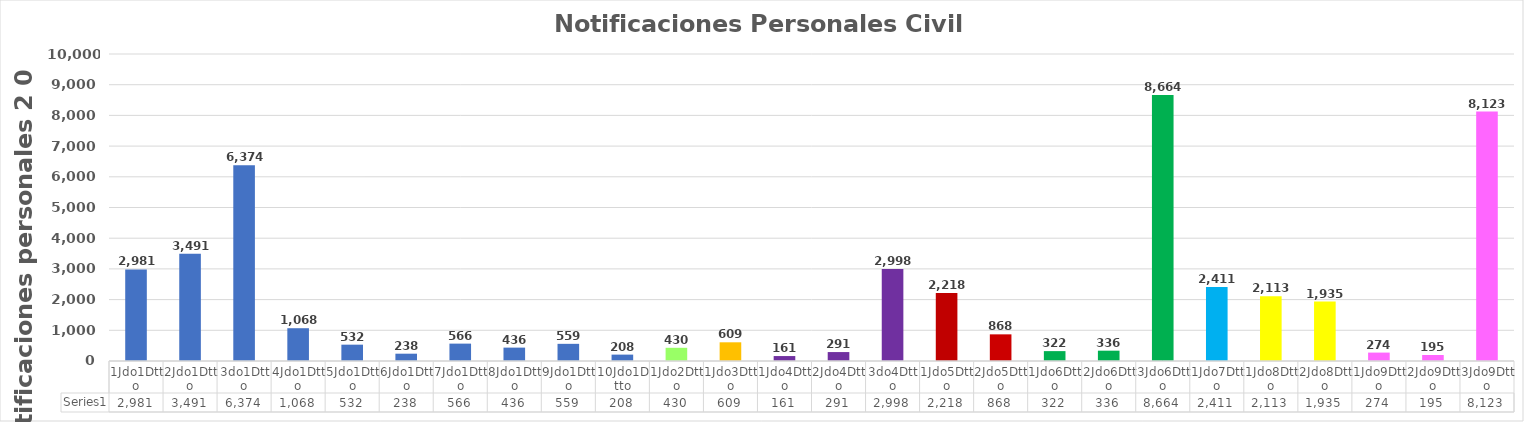
| Category | Series 0 |
|---|---|
| 1Jdo1Dtto | 2981 |
| 2Jdo1Dtto | 3491 |
| 3do1Dtto | 6374 |
| 4Jdo1Dtto | 1068 |
| 5Jdo1Dtto | 532 |
| 6Jdo1Dtto | 238 |
| 7Jdo1Dtto | 566 |
| 8Jdo1Dtto | 436 |
| 9Jdo1Dtto | 559 |
| 10Jdo1Dtto | 208 |
| 1Jdo2Dtto | 430 |
| 1Jdo3Dtto | 609 |
| 1Jdo4Dtto | 161 |
| 2Jdo4Dtto | 291 |
| 3do4Dtto | 2998 |
| 1Jdo5Dtto | 2218 |
| 2Jdo5Dtto | 868 |
| 1Jdo6Dtto | 322 |
| 2Jdo6Dtto | 336 |
| 3Jdo6Dtto | 8664 |
| 1Jdo7Dtto | 2411 |
| 1Jdo8Dtto | 2113 |
| 2Jdo8Dtto | 1935 |
| 1Jdo9Dtto | 274 |
| 2Jdo9Dtto | 195 |
| 3Jdo9Dtto | 8123 |